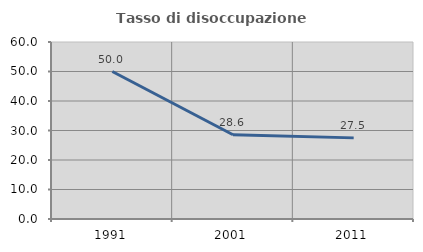
| Category | Tasso di disoccupazione giovanile  |
|---|---|
| 1991.0 | 50 |
| 2001.0 | 28.571 |
| 2011.0 | 27.5 |